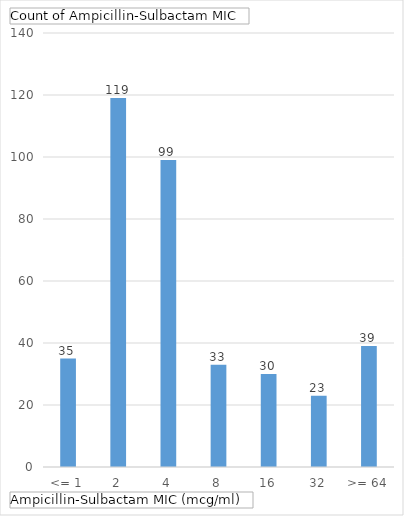
| Category | Total |
|---|---|
| <= 1 | 35 |
| 2 | 119 |
| 4 | 99 |
| 8 | 33 |
| 16 | 30 |
| 32 | 23 |
| >= 64 | 39 |